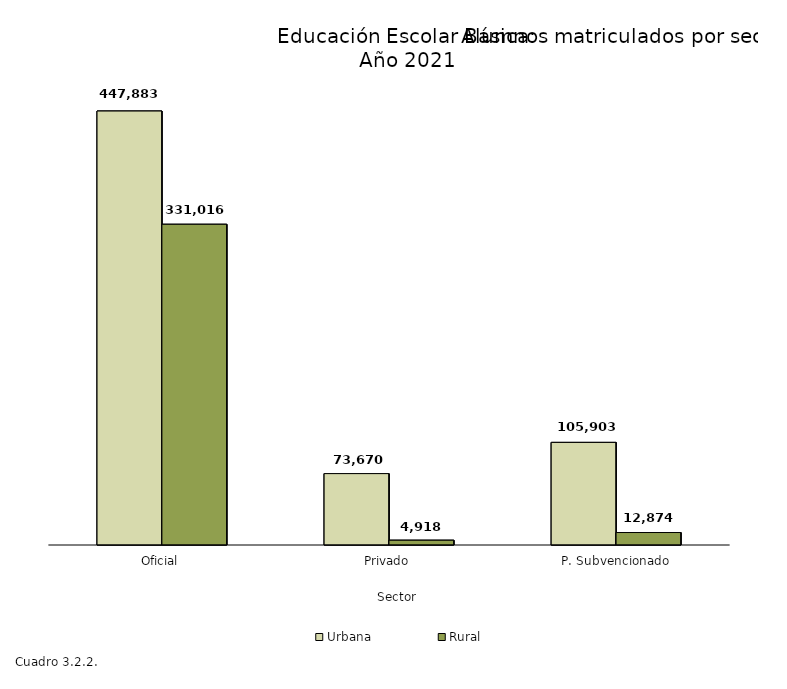
| Category | Urbana | Rural |
|---|---|---|
| Oficial | 447883 | 331016 |
| Privado | 73670 | 4918 |
| P. Subvencionado | 105903 | 12874 |